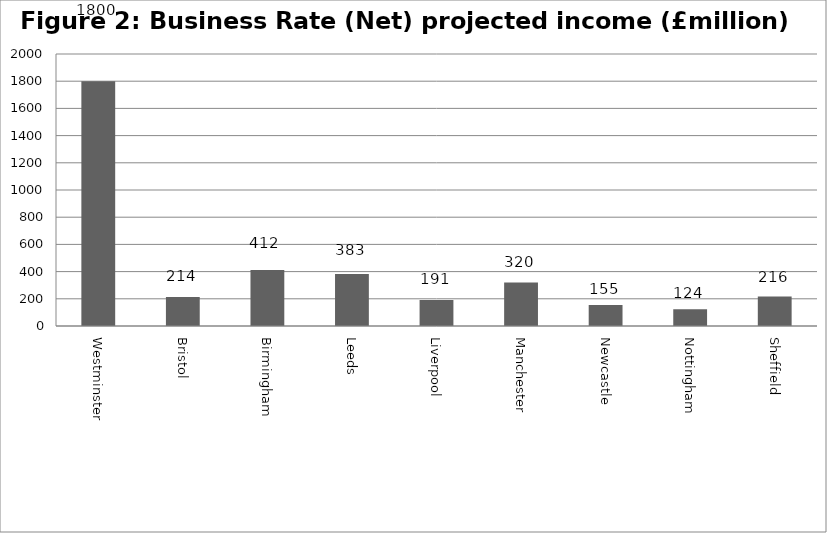
| Category | Series 0 | Series 1 |
|---|---|---|
| Westminster | 1800 | 0 |
| Bristol | 214 | 0 |
| Birmingham  | 412 | 0 |
| Leeds | 383 | 0 |
| Liverpool | 191 | 0 |
| Manchester | 320 | 0 |
| Newcastle | 155 | 0 |
| Nottingham | 124 | 0 |
| Sheffield | 216 | 0 |